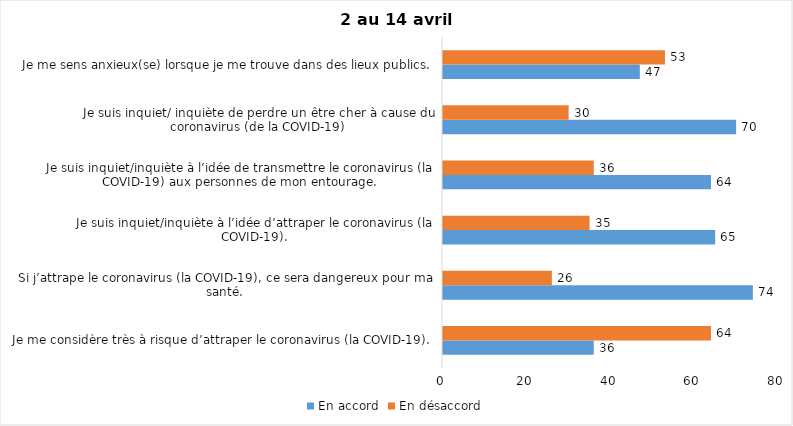
| Category | En accord | En désaccord |
|---|---|---|
| Je me considère très à risque d’attraper le coronavirus (la COVID-19). | 36 | 64 |
| Si j’attrape le coronavirus (la COVID-19), ce sera dangereux pour ma santé. | 74 | 26 |
| Je suis inquiet/inquiète à l’idée d’attraper le coronavirus (la COVID-19). | 65 | 35 |
| Je suis inquiet/inquiète à l’idée de transmettre le coronavirus (la COVID-19) aux personnes de mon entourage. | 64 | 36 |
| Je suis inquiet/ inquiète de perdre un être cher à cause du coronavirus (de la COVID-19) | 70 | 30 |
| Je me sens anxieux(se) lorsque je me trouve dans des lieux publics. | 47 | 53 |